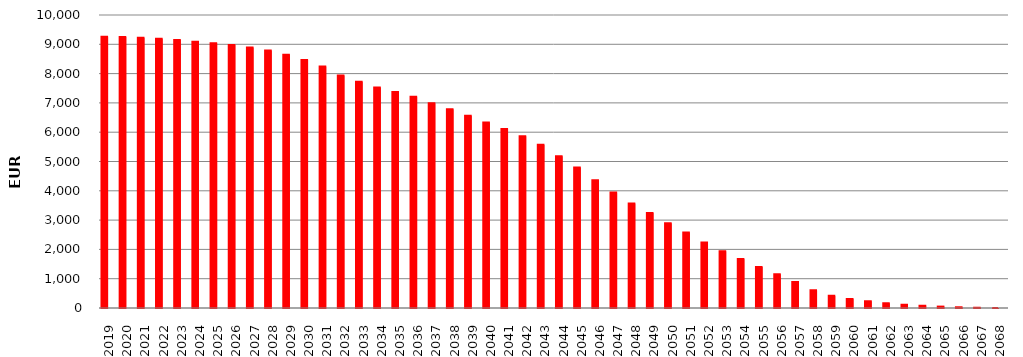
| Category |  9.258.642.589,23    | SumOfMont Cred Ced act |
|---|---|---|
| 2019 | 9256060192.54 | 2582396.69 |
| 2020 | 9246184737.91 | 9875454.63 |
| 2021 | 9223668984.09 | 22515753.82 |
| 2022 | 9189035326.68 | 34633657.41 |
| 2023 | 9144369286.95 | 44666039.73 |
| 2024 | 9090176890.63 | 54192396.32 |
| 2025 | 9035351835.58 | 54825055.05 |
| 2026 | 8972542299 | 62809536.58 |
| 2027 | 8887977372.68 | 84564926.32 |
| 2028 | 8789693242.04 | 98284130.64 |
| 2029 | 8643229973.32 | 146463268.72 |
| 2030 | 8461100908.08 | 182129065.24 |
| 2031 | 8238628192.52 | 222472715.56 |
| 2032 | 7934010651.74 | 304617540.78 |
| 2033 | 7718619232.25 | 215391419.49 |
| 2034 | 7528059459.29 | 190559772.96 |
| 2035 | 7375667846.26 | 152391613.03 |
| 2036 | 7207652251.44 | 168015594.82 |
| 2037 | 6990654067.94 | 216998183.5 |
| 2038 | 6779895715.41 | 210758352.53 |
| 2039 | 6563962950.28 | 215932765.13 |
| 2040 | 6329120441.86 | 234842508.42 |
| 2041 | 6109053763.55 | 220066678.31 |
| 2042 | 5865438066.15 | 243615697.4 |
| 2043 | 5569725657.96 | 295712408.19 |
| 2044 | 5175985857.39 | 393739800.57 |
| 2045 | 4798311775.84 | 377674081.55 |
| 2046 | 4359580711.06 | 438731064.78 |
| 2047 | 3937936472.19 | 421644238.87 |
| 2048 | 3567794776.34 | 370141695.85 |
| 2049 | 3245858196.3 | 321936580.04 |
| 2050 | 2891468136.46 | 354390059.84 |
| 2051 | 2576475290.1 | 314992846.36 |
| 2052 | 2238457842.65 | 338017447.45 |
| 2053 | 1935298102.66 | 303159739.99 |
| 2054 | 1669065684.23 | 266232418.43 |
| 2055 | 1399133307.18 | 269932377.05 |
| 2056 | 1151670906.6 | 247462400.58 |
| 2057 | 889119149.84 | 262551756.76 |
| 2058 | 602065344.58 | 287053805.26 |
| 2059 | 415771813.2 | 186293531.38 |
| 2060 | 310739126.08 | 105032687.12 |
| 2061 | 230625293 | 80113833.08 |
| 2062 | 162726600.58 | 67898692.42 |
| 2063 | 107702990.61 | 55023609.97 |
| 2064 | 76975314.35 | 30727676.26 |
| 2065 | 47683412.76 | 29291901.59 |
| 2066 | 24664842.37 | 23018570.39 |
| 2067 | 9041561.79 | 15623280.58 |
| 2068 | 0 | 9041561.79 |